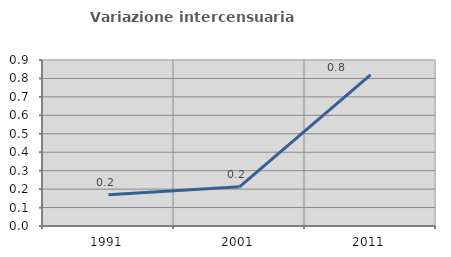
| Category | Variazione intercensuaria annua |
|---|---|
| 1991.0 | 0.17 |
| 2001.0 | 0.212 |
| 2011.0 | 0.819 |